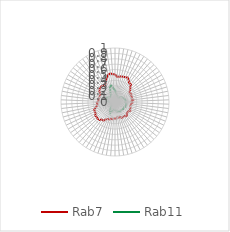
| Category | Rab7 | Rab11 |
|---|---|---|
| 0.0 | 0.513 | 0.228 |
| 0.10913 | 0.467 | 0.174 |
| 0.21825 | 0.474 | 0.156 |
| 0.32738 | 0.486 | 0.13 |
| 0.43651 | 0.493 | 0.121 |
| 0.54563 | 0.497 | 0.108 |
| 0.65476 | 0.51 | 0.111 |
| 0.76389 | 0.475 | 0.101 |
| 0.87302 | 0.436 | 0.095 |
| 0.98214 | 0.447 | 0.105 |
| 1.09127 | 0.389 | 0.123 |
| 1.2004 | 0.366 | 0.135 |
| 1.30952 | 0.326 | 0.153 |
| 1.41865 | 0.317 | 0.165 |
| 1.52778 | 0.331 | 0.164 |
| 1.6369 | 0.321 | 0.173 |
| 1.74603 | 0.326 | 0.189 |
| 1.85516 | 0.315 | 0.198 |
| 1.96429 | 0.342 | 0.202 |
| 2.07341 | 0.304 | 0.199 |
| 2.18254 | 0.322 | 0.193 |
| 2.29167 | 0.299 | 0.219 |
| 2.40079 | 0.296 | 0.203 |
| 2.50992 | 0.294 | 0.21 |
| 2.61905 | 0.306 | 0.201 |
| 2.72817 | 0.309 | 0.209 |
| 2.8373 | 0.325 | 0.193 |
| 2.94643 | 0.301 | 0.2 |
| 3.05556 | 0.3 | 0.201 |
| 3.16468 | 0.302 | 0.192 |
| 3.27381 | 0.337 | 0.193 |
| 3.38294 | 0.33 | 0.183 |
| 3.49206 | 0.306 | 0.19 |
| 3.60119 | 0.312 | 0.184 |
| 3.71032 | 0.318 | 0.188 |
| 3.81944 | 0.291 | 0.186 |
| 3.92857 | 0.298 | 0.187 |
| 4.0377 | 0.28 | 0.173 |
| 4.14683 | 0.312 | 0.153 |
| 4.25595 | 0.304 | 0.161 |
| 4.36508 | 0.31 | 0.146 |
| 4.47421 | 0.323 | 0.13 |
| 4.58333 | 0.319 | 0.14 |
| 4.69246 | 0.341 | 0.18 |
| 4.80159 | 0.341 | 0.218 |
| 4.91071 | 0.364 | 0.214 |
| 5.01984 | 0.406 | 0.177 |
| 5.12897 | 0.408 | 0.12 |
| 5.2381 | 0.446 | 0.106 |
| 5.34722 | 0.446 | 0.085 |
| 5.45635 | 0.435 | 0.078 |
| 5.56548 | 0.445 | 0.081 |
| 5.6746 | 0.416 | 0.08 |
| 5.78373 | 0.41 | 0.087 |
| 5.89286 | 0.417 | 0.07 |
| 6.00198 | 0.373 | 0.061 |
| 6.11111 | 0.34 | 0.069 |
| 6.22024 | 0.328 | 0.078 |
| 6.32937 | 0.337 | 0.087 |
| 6.43849 | 0.31 | 0.113 |
| 6.54762 | 0.306 | 0.125 |
| 6.65675 | 0.314 | 0.151 |
| 6.76587 | 0.298 | 0.175 |
| 6.875 | 0.302 | 0.196 |
| 6.98413 | 0.298 | 0.179 |
| 7.09325 | 0.317 | 0.161 |
| 7.20238 | 0.353 | 0.145 |
| 7.31151 | 0.367 | 0.138 |
| 7.42063 | 0.377 | 0.124 |
| 7.52976 | 0.382 | 0.129 |
| 7.63889 | 0.374 | 0.118 |
| 7.74802 | 0.349 | 0.138 |
| 7.85714 | 0.38 | 0.175 |
| 7.96627 | 0.439 | 0.218 |
| 8.0754 | 0.471 | 0.287 |
| 8.18452 | 0.522 | 0.315 |
| 8.29365 | 0.536 | 0.287 |
| 8.40278 | 0.518 | 0.236 |